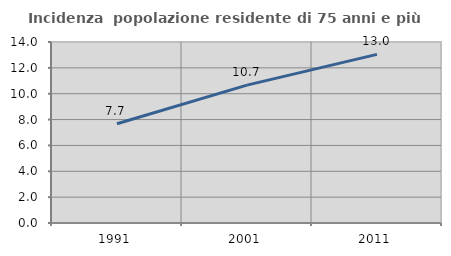
| Category | Incidenza  popolazione residente di 75 anni e più |
|---|---|
| 1991.0 | 7.676 |
| 2001.0 | 10.667 |
| 2011.0 | 13.041 |